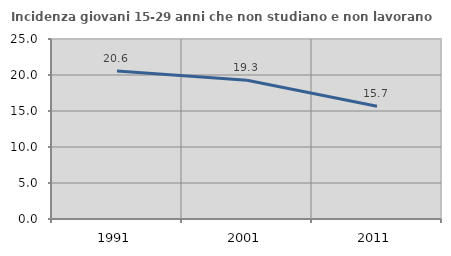
| Category | Incidenza giovani 15-29 anni che non studiano e non lavorano  |
|---|---|
| 1991.0 | 20.559 |
| 2001.0 | 19.277 |
| 2011.0 | 15.663 |